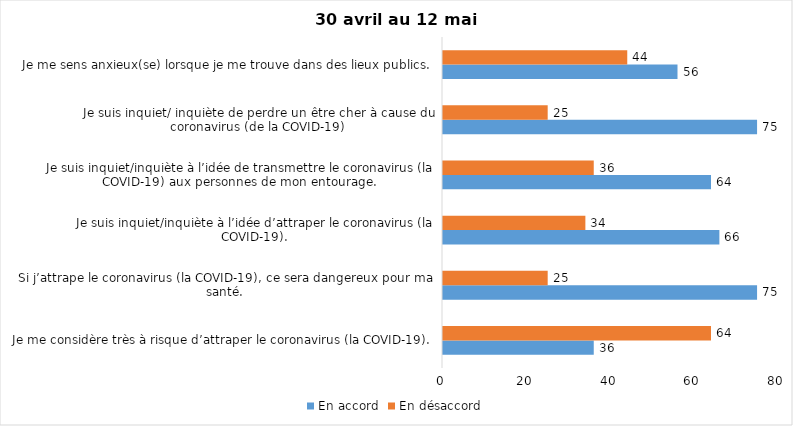
| Category | En accord | En désaccord |
|---|---|---|
| Je me considère très à risque d’attraper le coronavirus (la COVID-19). | 36 | 64 |
| Si j’attrape le coronavirus (la COVID-19), ce sera dangereux pour ma santé. | 75 | 25 |
| Je suis inquiet/inquiète à l’idée d’attraper le coronavirus (la COVID-19). | 66 | 34 |
| Je suis inquiet/inquiète à l’idée de transmettre le coronavirus (la COVID-19) aux personnes de mon entourage. | 64 | 36 |
| Je suis inquiet/ inquiète de perdre un être cher à cause du coronavirus (de la COVID-19) | 75 | 25 |
| Je me sens anxieux(se) lorsque je me trouve dans des lieux publics. | 56 | 44 |